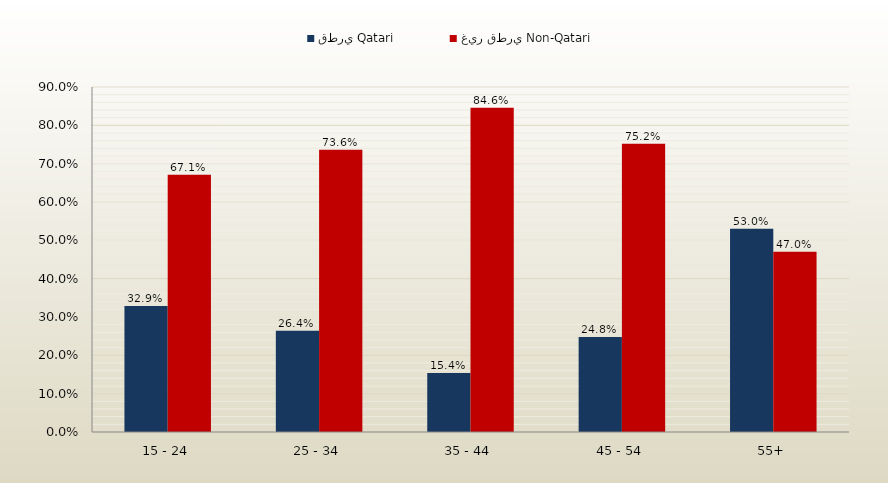
| Category | قطري Qatari | غير قطري Non-Qatari |
|---|---|---|
| 15 - 24 | 0.329 | 0.671 |
| 25 - 34 | 0.264 | 0.736 |
| 35 - 44 | 0.154 | 0.846 |
| 45 - 54 | 0.248 | 0.752 |
| 55+ | 0.53 | 0.47 |